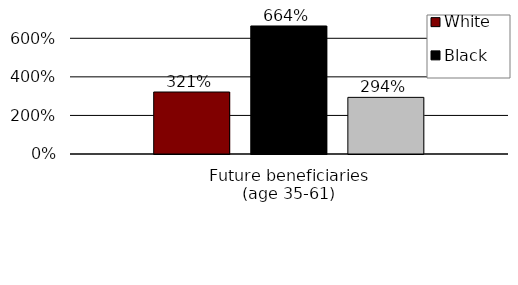
| Category | White | Black | Hispanic |
|---|---|---|---|
| Future beneficiaries
(age 35-61) | 3.215 | 6.638 | 2.937 |